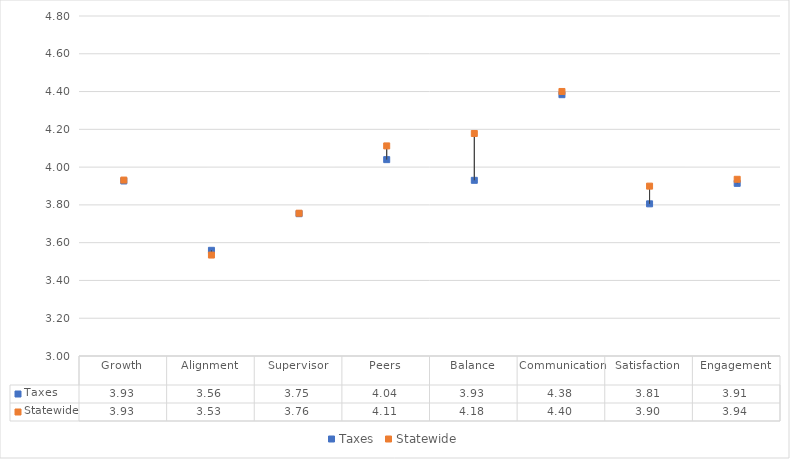
| Category | Taxes | Statewide |
|---|---|---|
| Growth | 3.927 | 3.931 |
| Alignment | 3.559 | 3.534 |
| Supervisor | 3.753 | 3.756 |
| Peers | 4.04 | 4.112 |
| Balance | 3.93 | 4.178 |
| Communication | 4.383 | 4.4 |
| Satisfaction | 3.806 | 3.899 |
| Engagement | 3.914 | 3.936 |